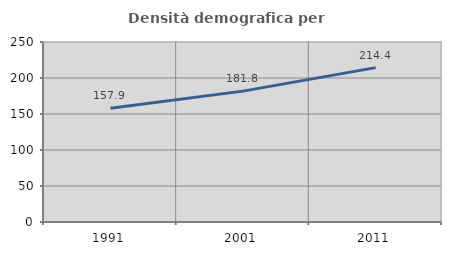
| Category | Densità demografica |
|---|---|
| 1991.0 | 157.909 |
| 2001.0 | 181.772 |
| 2011.0 | 214.423 |